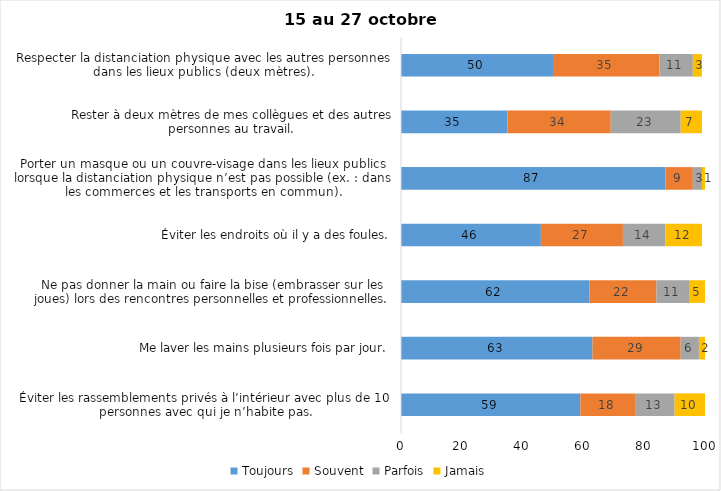
| Category | Toujours | Souvent | Parfois | Jamais |
|---|---|---|---|---|
| Éviter les rassemblements privés à l’intérieur avec plus de 10 personnes avec qui je n’habite pas. | 59 | 18 | 13 | 10 |
| Me laver les mains plusieurs fois par jour. | 63 | 29 | 6 | 2 |
| Ne pas donner la main ou faire la bise (embrasser sur les joues) lors des rencontres personnelles et professionnelles. | 62 | 22 | 11 | 5 |
| Éviter les endroits où il y a des foules. | 46 | 27 | 14 | 12 |
| Porter un masque ou un couvre-visage dans les lieux publics lorsque la distanciation physique n’est pas possible (ex. : dans les commerces et les transports en commun). | 87 | 9 | 3 | 1 |
| Rester à deux mètres de mes collègues et des autres personnes au travail. | 35 | 34 | 23 | 7 |
| Respecter la distanciation physique avec les autres personnes dans les lieux publics (deux mètres). | 50 | 35 | 11 | 3 |